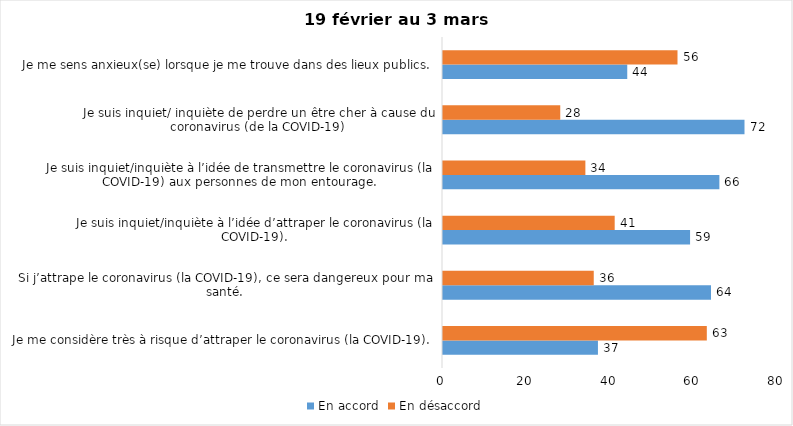
| Category | En accord | En désaccord |
|---|---|---|
| Je me considère très à risque d’attraper le coronavirus (la COVID-19). | 37 | 63 |
| Si j’attrape le coronavirus (la COVID-19), ce sera dangereux pour ma santé. | 64 | 36 |
| Je suis inquiet/inquiète à l’idée d’attraper le coronavirus (la COVID-19). | 59 | 41 |
| Je suis inquiet/inquiète à l’idée de transmettre le coronavirus (la COVID-19) aux personnes de mon entourage. | 66 | 34 |
| Je suis inquiet/ inquiète de perdre un être cher à cause du coronavirus (de la COVID-19) | 72 | 28 |
| Je me sens anxieux(se) lorsque je me trouve dans des lieux publics. | 44 | 56 |